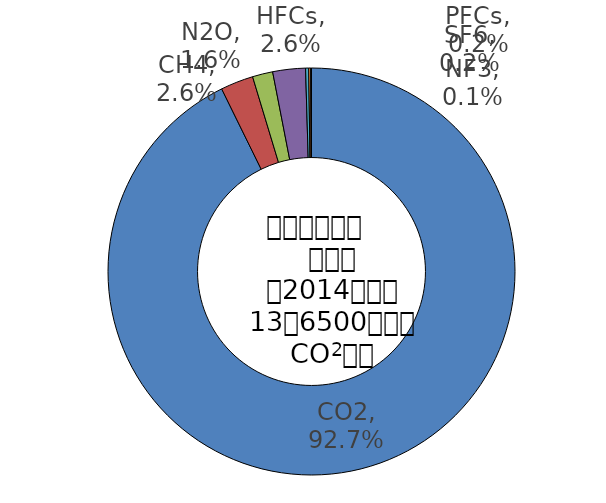
| Category | Series 0 |
|---|---|
| CO2 | 0.927 |
| CH4 | 0.026 |
| N2O | 0.016 |
| HFCs | 0.026 |
| PFCs | 0.002 |
| SF6 | 0.002 |
| NF3 | 0.001 |